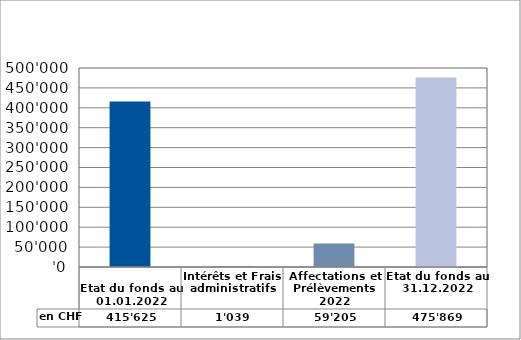
| Category | en CHF |
|---|---|
| 
Etat du fonds au 01.01.2022

 | 415625 |
| Intérêts et Frais administratifs | 1039 |
| Affectations et Prélèvements 2022 | 59205 |
| Etat du fonds au 31.12.2022 | 475869 |